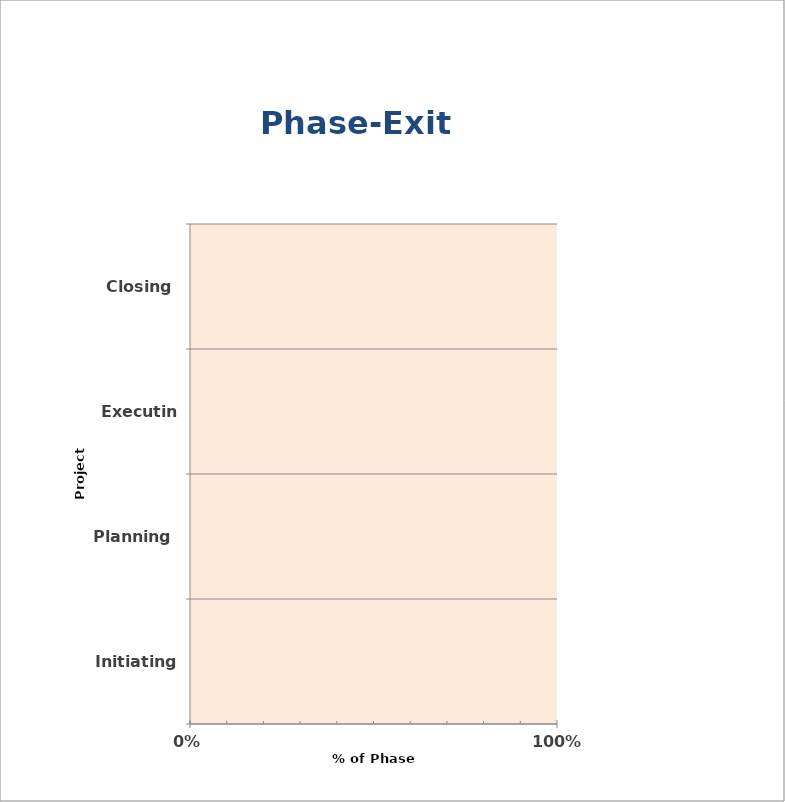
| Category | % of phase completion |
|---|---|
| Initiating | 0 |
| Planning | 0 |
| Executing | 0 |
| Closing | 0 |